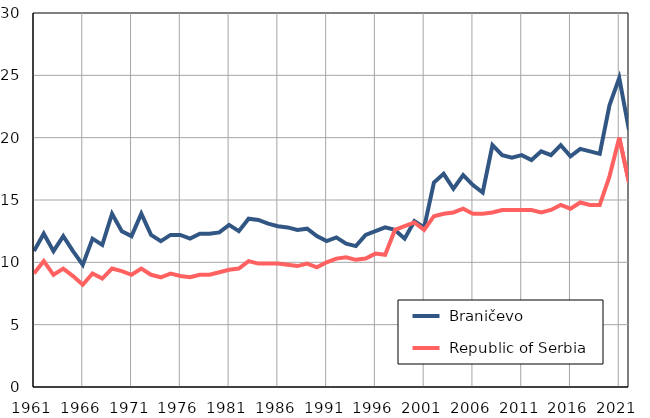
| Category |  Braničevo |  Republic of Serbia |
|---|---|---|
| 1961.0 | 10.9 | 9.1 |
| 1962.0 | 12.3 | 10.1 |
| 1963.0 | 10.9 | 9 |
| 1964.0 | 12.1 | 9.5 |
| 1965.0 | 10.9 | 8.9 |
| 1966.0 | 9.8 | 8.2 |
| 1967.0 | 11.9 | 9.1 |
| 1968.0 | 11.4 | 8.7 |
| 1969.0 | 13.9 | 9.5 |
| 1970.0 | 12.5 | 9.3 |
| 1971.0 | 12.1 | 9 |
| 1972.0 | 13.9 | 9.5 |
| 1973.0 | 12.2 | 9 |
| 1974.0 | 11.7 | 8.8 |
| 1975.0 | 12.2 | 9.1 |
| 1976.0 | 12.2 | 8.9 |
| 1977.0 | 11.9 | 8.8 |
| 1978.0 | 12.3 | 9 |
| 1979.0 | 12.3 | 9 |
| 1980.0 | 12.4 | 9.2 |
| 1981.0 | 13 | 9.4 |
| 1982.0 | 12.5 | 9.5 |
| 1983.0 | 13.5 | 10.1 |
| 1984.0 | 13.4 | 9.9 |
| 1985.0 | 13.1 | 9.9 |
| 1986.0 | 12.9 | 9.9 |
| 1987.0 | 12.8 | 9.8 |
| 1988.0 | 12.6 | 9.7 |
| 1989.0 | 12.7 | 9.9 |
| 1990.0 | 12.1 | 9.6 |
| 1991.0 | 11.7 | 10 |
| 1992.0 | 12 | 10.3 |
| 1993.0 | 11.5 | 10.4 |
| 1994.0 | 11.3 | 10.2 |
| 1995.0 | 12.2 | 10.3 |
| 1996.0 | 12.5 | 10.7 |
| 1997.0 | 12.8 | 10.6 |
| 1998.0 | 12.6 | 12.6 |
| 1999.0 | 11.9 | 12.9 |
| 2000.0 | 13.3 | 13.2 |
| 2001.0 | 12.8 | 12.6 |
| 2002.0 | 16.4 | 13.7 |
| 2003.0 | 17.1 | 13.9 |
| 2004.0 | 15.9 | 14 |
| 2005.0 | 17 | 14.3 |
| 2006.0 | 16.2 | 13.9 |
| 2007.0 | 15.6 | 13.9 |
| 2008.0 | 19.4 | 14 |
| 2009.0 | 18.6 | 14.2 |
| 2010.0 | 18.4 | 14.2 |
| 2011.0 | 18.6 | 14.2 |
| 2012.0 | 18.2 | 14.2 |
| 2013.0 | 18.9 | 14 |
| 2014.0 | 18.6 | 14.2 |
| 2015.0 | 19.4 | 14.6 |
| 2016.0 | 18.5 | 14.3 |
| 2017.0 | 19.1 | 14.8 |
| 2018.0 | 18.9 | 14.6 |
| 2019.0 | 18.7 | 14.6 |
| 2020.0 | 22.6 | 16.9 |
| 2021.0 | 24.8 | 20 |
| 2022.0 | 20.6 | 16.4 |